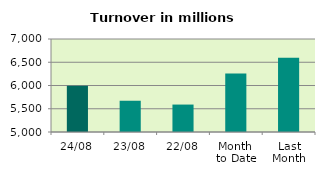
| Category | Series 0 |
|---|---|
| 24/08 | 5996.745 |
| 23/08 | 5672.105 |
| 22/08 | 5590.031 |
| Month 
to Date | 6258.686 |
| Last
Month | 6596.254 |